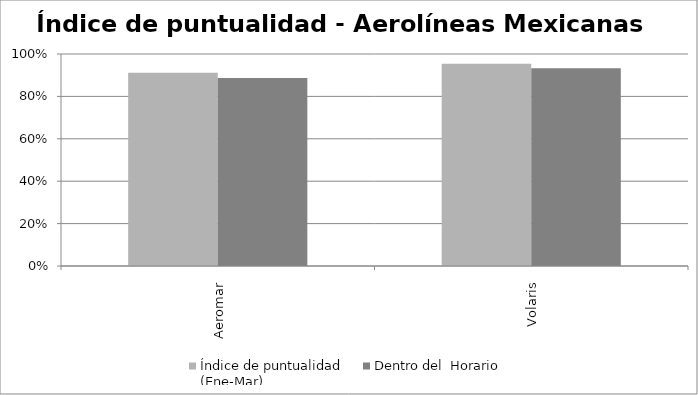
| Category | Índice de puntualidad
(Ene-Mar) | Dentro del  Horario |
|---|---|---|
| Aeromar | 0.912 | 0.886 |
| Volaris | 0.954 | 0.933 |